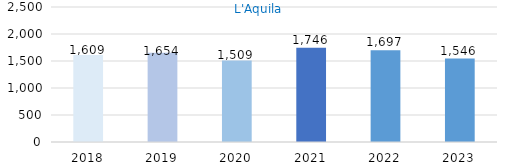
| Category | Series 0 |
|---|---|
| 2018.0 | 1609 |
| 2019.0 | 1654 |
| 2020.0 | 1509 |
| 2021.0 | 1746 |
| 2022.0 | 1697 |
| 2023.0 | 1546 |